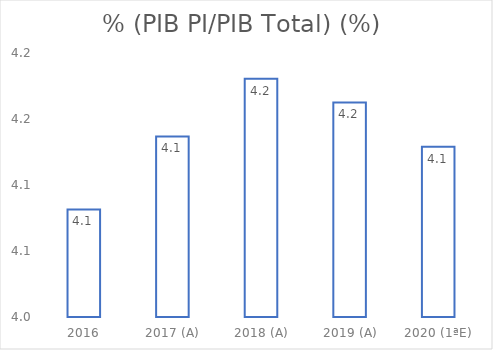
| Category | % (PIB PI/PIB Total) (%) |
|---|---|
| 2016 | 4.081 |
| 2017 (A) | 4.137 |
| 2018 (A) | 4.18 |
| 2019 (A) | 4.163 |
| 2020 (1ªE) | 4.129 |